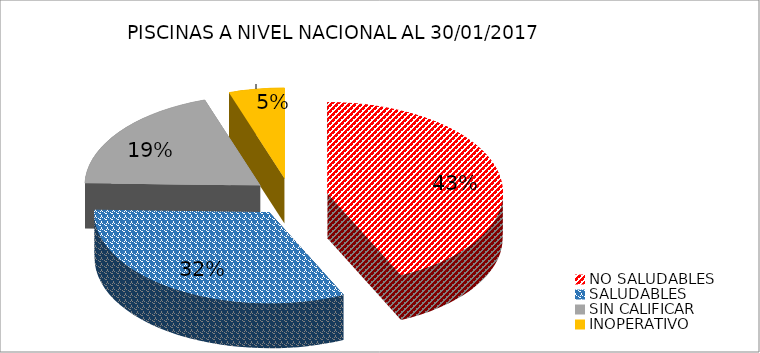
| Category | N.° | PORCENTAJE (%) |
|---|---|---|
| NO SALUDABLES | 328 | 0.43 |
| SALUDABLES | 246 | 0.32 |
| SIN CALIFICAR | 148 | 0.2 |
| INOPERATIVO | 39 | 0.05 |